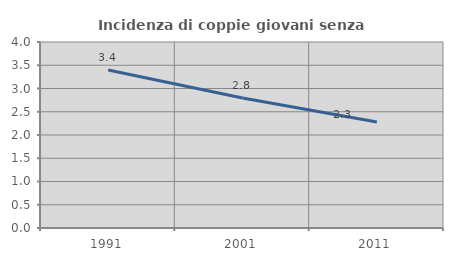
| Category | Incidenza di coppie giovani senza figli |
|---|---|
| 1991.0 | 3.397 |
| 2001.0 | 2.794 |
| 2011.0 | 2.281 |